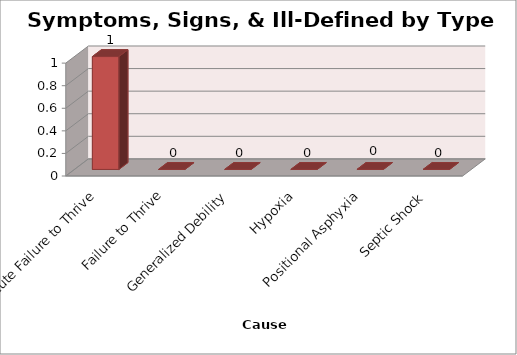
| Category | Series 0 |
|---|---|
| Acute Failure to Thrive | 1 |
| Failure to Thrive | 0 |
| Generalized Debility | 0 |
| Hypoxia | 0 |
| Positional Asphyxia | 0 |
| Septic Shock | 0 |